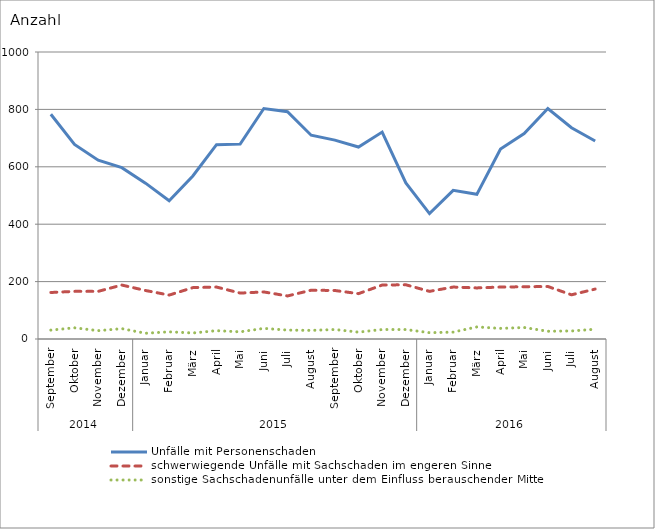
| Category | Unfälle mit Personenschaden | schwerwiegende Unfälle mit Sachschaden im engeren Sinne | sonstige Sachschadenunfälle unter dem Einfluss berauschender Mittel |
|---|---|---|---|
| 0 | 783 | 162 | 31 |
| 1 | 678 | 166 | 39 |
| 2 | 623 | 166 | 29 |
| 3 | 597 | 188 | 36 |
| 4 | 543 | 169 | 20 |
| 5 | 482 | 153 | 25 |
| 6 | 568 | 179 | 21 |
| 7 | 677 | 181 | 29 |
| 8 | 679 | 160 | 25 |
| 9 | 803 | 164 | 37 |
| 10 | 792 | 150 | 31 |
| 11 | 710 | 170 | 30 |
| 12 | 693 | 169 | 33 |
| 13 | 669 | 158 | 24 |
| 14 | 721 | 188 | 33 |
| 15 | 544 | 189 | 33 |
| 16 | 437 | 166 | 22 |
| 17 | 518 | 181 | 24 |
| 18 | 504 | 178 | 42 |
| 19 | 662 | 181 | 37 |
| 20 | 716 | 182 | 40 |
| 21 | 803 | 183 | 27 |
| 22 | 736 | 154 | 28 |
| 23 | 690 | 174 | 34 |